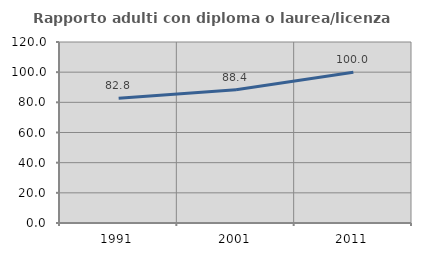
| Category | Rapporto adulti con diploma o laurea/licenza media  |
|---|---|
| 1991.0 | 82.759 |
| 2001.0 | 88.372 |
| 2011.0 | 100 |